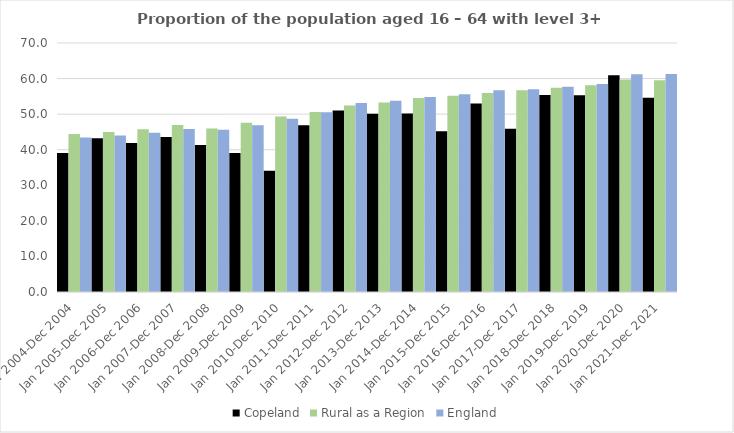
| Category | Copeland | Rural as a Region | England |
|---|---|---|---|
| Jan 2004-Dec 2004 | 39.1 | 44.405 | 43.4 |
| Jan 2005-Dec 2005 | 43.2 | 44.973 | 44 |
| Jan 2006-Dec 2006 | 41.9 | 45.774 | 44.8 |
| Jan 2007-Dec 2007 | 43.6 | 46.968 | 45.8 |
| Jan 2008-Dec 2008 | 41.3 | 45.964 | 45.6 |
| Jan 2009-Dec 2009 | 39.1 | 47.59 | 46.9 |
| Jan 2010-Dec 2010 | 34.1 | 49.362 | 48.7 |
| Jan 2011-Dec 2011 | 46.9 | 50.602 | 50.5 |
| Jan 2012-Dec 2012 | 51 | 52.439 | 53.1 |
| Jan 2013-Dec 2013 | 50.1 | 53.276 | 53.8 |
| Jan 2014-Dec 2014 | 50.2 | 54.57 | 54.8 |
| Jan 2015-Dec 2015 | 45.2 | 55.16 | 55.6 |
| Jan 2016-Dec 2016 | 53 | 55.941 | 56.7 |
| Jan 2017-Dec 2017 | 45.9 | 56.689 | 57 |
| Jan 2018-Dec 2018 | 55.4 | 57.389 | 57.7 |
| Jan 2019-Dec 2019 | 55.3 | 58.147 | 58.5 |
| Jan 2020-Dec 2020 | 60.9 | 59.771 | 61.2 |
| Jan 2021-Dec 2021 | 54.6 | 59.54 | 61.3 |